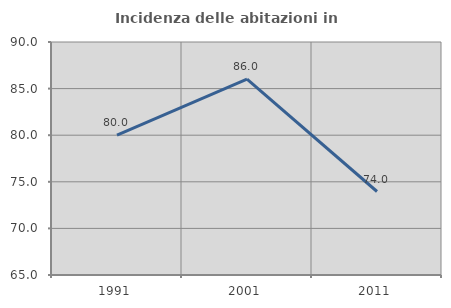
| Category | Incidenza delle abitazioni in proprietà  |
|---|---|
| 1991.0 | 80 |
| 2001.0 | 86.022 |
| 2011.0 | 73.958 |